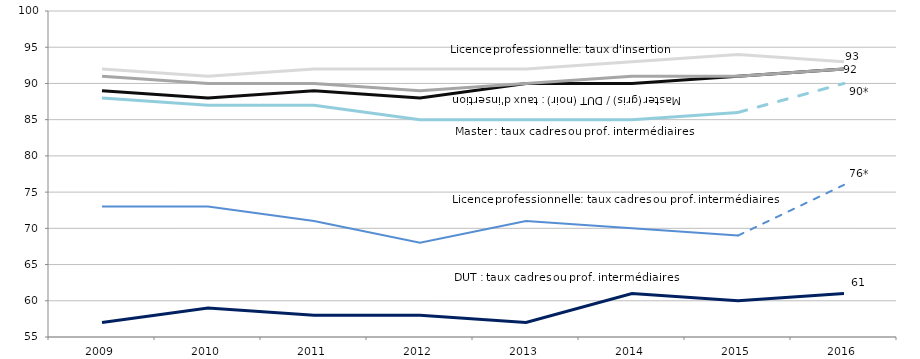
| Category | DUT   | Licence professionnelle | Master |
|---|---|---|---|
| 2009.0 | 89 | 92 | 91 |
| 2010.0 | 88 | 91 | 90 |
| 2011.0 | 89 | 92 | 90 |
| 2012.0 | 88 | 92 | 89 |
| 2013.0 | 90 | 92 | 90 |
| 2014.0 | 90 | 93 | 91 |
| 2015.0 | 91 | 94 | 91 |
| 2016.0 | 92 | 93 | 92 |